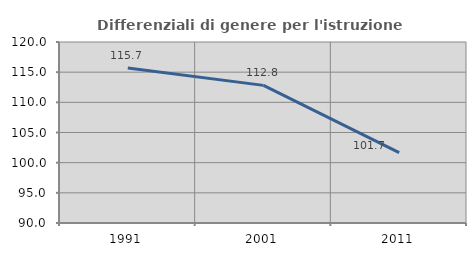
| Category | Differenziali di genere per l'istruzione superiore |
|---|---|
| 1991.0 | 115.701 |
| 2001.0 | 112.81 |
| 2011.0 | 101.665 |